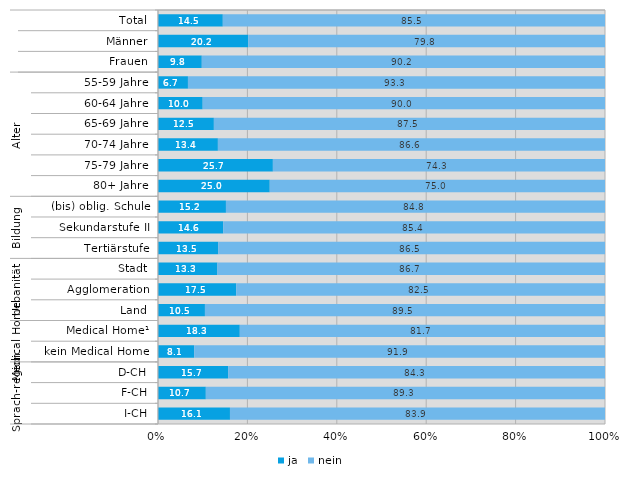
| Category | ja | nein |
|---|---|---|
| 0 | 14.5 | 85.5 |
| 1 | 20.2 | 79.8 |
| 2 | 9.8 | 90.2 |
| 3 | 6.7 | 93.3 |
| 4 | 10 | 90 |
| 5 | 12.5 | 87.5 |
| 6 | 13.4 | 86.6 |
| 7 | 25.7 | 74.3 |
| 8 | 25 | 75 |
| 9 | 15.2 | 84.8 |
| 10 | 14.6 | 85.4 |
| 11 | 13.5 | 86.5 |
| 12 | 13.3 | 86.7 |
| 13 | 17.5 | 82.5 |
| 14 | 10.5 | 89.5 |
| 15 | 18.3 | 81.7 |
| 16 | 8.1 | 91.9 |
| 17 | 15.7 | 84.3 |
| 18 | 10.7 | 89.3 |
| 19 | 16.1 | 83.9 |